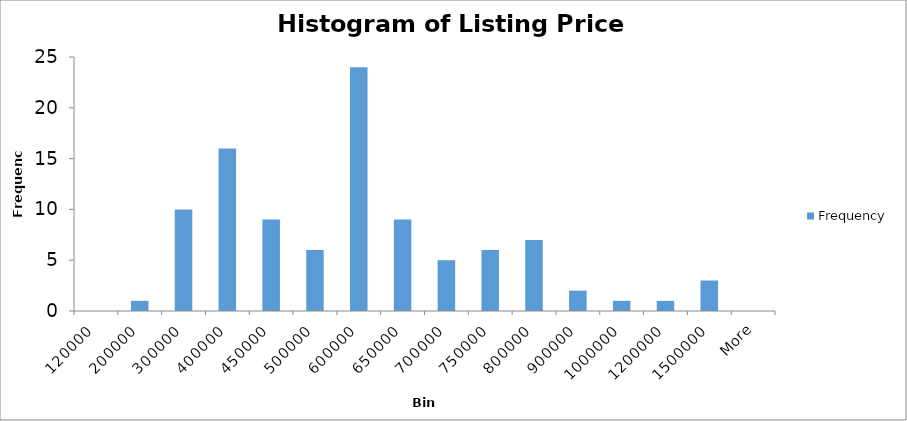
| Category | Frequency |
|---|---|
| 120000 | 0 |
| 200000 | 1 |
| 300000 | 10 |
| 400000 | 16 |
| 450000 | 9 |
| 500000 | 6 |
| 600000 | 24 |
| 650000 | 9 |
| 700000 | 5 |
| 750000 | 6 |
| 800000 | 7 |
| 900000 | 2 |
| 1000000 | 1 |
| 1200000 | 1 |
| 1500000 | 3 |
| More | 0 |